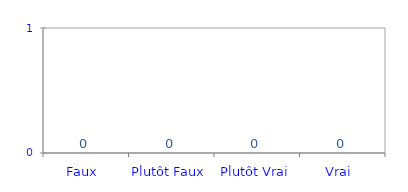
| Category | Véracité Critères |
|---|---|
| Faux  | 0 |
| Plutôt Faux | 0 |
| Plutôt Vrai | 0 |
| Vrai  | 0 |